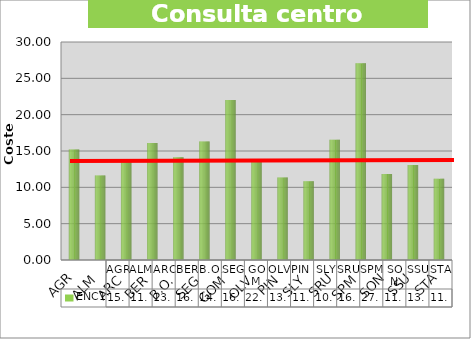
| Category | ENC1 |
|---|---|
| AGR | 15.22 |
| ALM | 11.64 |
| ARC | 13.481 |
| BER | 16.088 |
| B.O. | 14.135 |
| SEG | 16.31 |
| GOM | 22.031 |
| OLV | 13.589 |
| PIN | 11.342 |
| SLY | 10.835 |
| SRU | 16.547 |
| SPM | 27.066 |
| SON | 11.832 |
| SSU | 13.073 |
| STA | 11.173 |